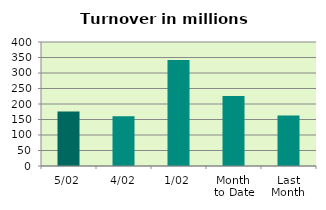
| Category | Series 0 |
|---|---|
| 5/02 | 175.558 |
| 4/02 | 160.646 |
| 1/02 | 341.996 |
| Month 
to Date | 226.067 |
| Last
Month | 163.101 |